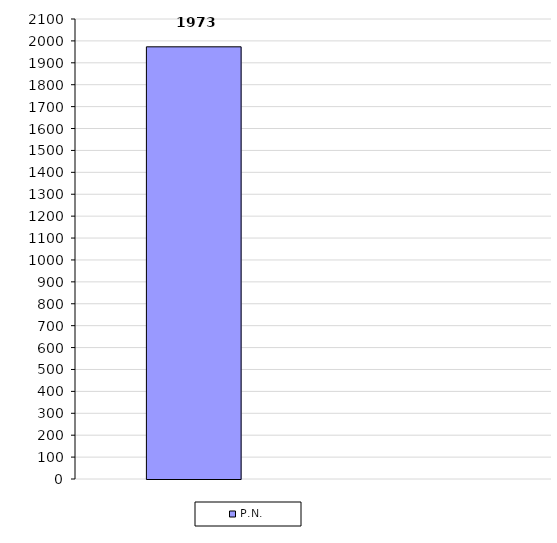
| Category | P.N. | INACIF |
|---|---|---|
| INACIF | 1973 |  |